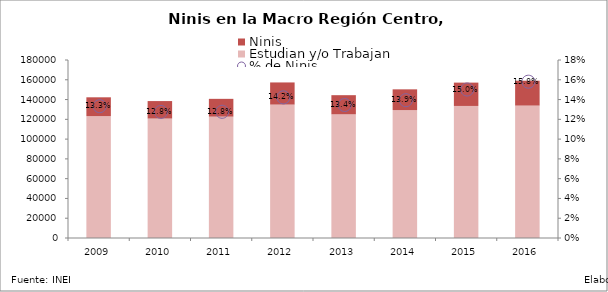
| Category | Estudian y/o Trabajan | Ninis |
|---|---|---|
| 2009.0 | 123318.744 | 18961.706 |
| 2010.0 | 120815.031 | 17656.239 |
| 2011.0 | 122759.906 | 17958.424 |
| 2012.0 | 134934.367 | 22371.103 |
| 2013.0 | 125004.653 | 19421.597 |
| 2014.0 | 129384.202 | 20945.468 |
| 2015.0 | 133533.319 | 23595.521 |
| 2016.0 | 133918.197 | 25139.543 |